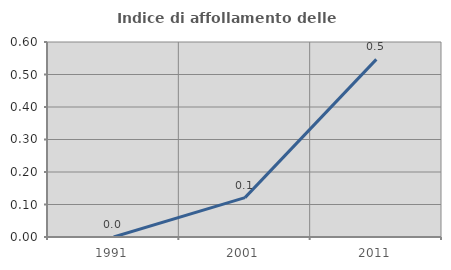
| Category | Indice di affollamento delle abitazioni  |
|---|---|
| 1991.0 | 0 |
| 2001.0 | 0.121 |
| 2011.0 | 0.546 |